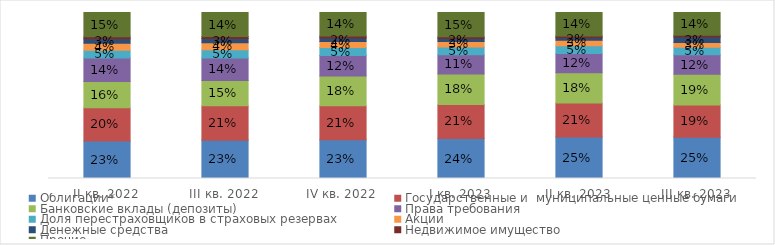
| Category | Облигации* | Государственные и  муниципальные ценные бумаги | Банковские вклады (депозиты) | Права требования | Доля перестраховщиков в страховых резервах | Акции  | Денежные средства | Недвижимое имущество | Прочие |
|---|---|---|---|---|---|---|---|---|---|
| II кв. 2022 | 0.226 | 0.2 | 0.159 | 0.141 | 0.048 | 0.042 | 0.026 | 0.012 | 0.146 |
| III кв. 2022 | 0.231 | 0.207 | 0.153 | 0.136 | 0.05 | 0.041 | 0.026 | 0.012 | 0.145 |
| IV кв. 2022 | 0.233 | 0.205 | 0.178 | 0.125 | 0.047 | 0.036 | 0.021 | 0.011 | 0.142 |
| I кв. 2023 | 0.241 | 0.206 | 0.184 | 0.115 | 0.047 | 0.034 | 0.018 | 0.011 | 0.145 |
| II кв. 2023 | 0.25 | 0.206 | 0.182 | 0.116 | 0.047 | 0.032 | 0.016 | 0.011 | 0.141 |
| III кв. 2023 | 0.249 | 0.194 | 0.186 | 0.117 | 0.045 | 0.029 | 0.034 | 0.011 | 0.136 |